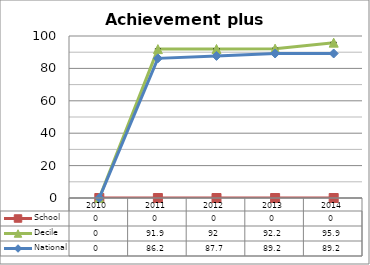
| Category | School  | Decile | National |
|---|---|---|---|
| 2010.0 | 0 | 0 | 0 |
| 2011.0 | 0 | 91.9 | 86.2 |
| 2012.0 | 0 | 92 | 87.7 |
| 2013.0 | 0 | 92.2 | 89.2 |
| 2014.0 | 0 | 95.9 | 89.2 |